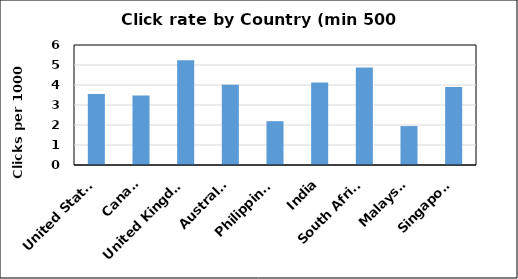
| Category | Series 0 |
|---|---|
| United States | 3.548 |
| Canada | 3.469 |
| United Kingdom | 5.236 |
| Australia | 4.014 |
| Philippines | 2.191 |
| India | 4.121 |
| South Africa | 4.872 |
| Malaysia | 1.946 |
| Singapore | 3.906 |